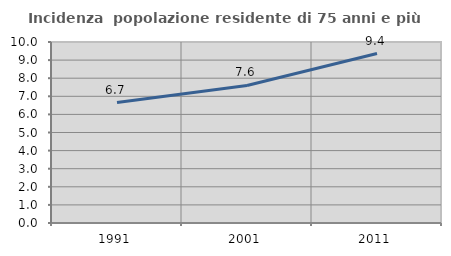
| Category | Incidenza  popolazione residente di 75 anni e più |
|---|---|
| 1991.0 | 6.654 |
| 2001.0 | 7.599 |
| 2011.0 | 9.364 |